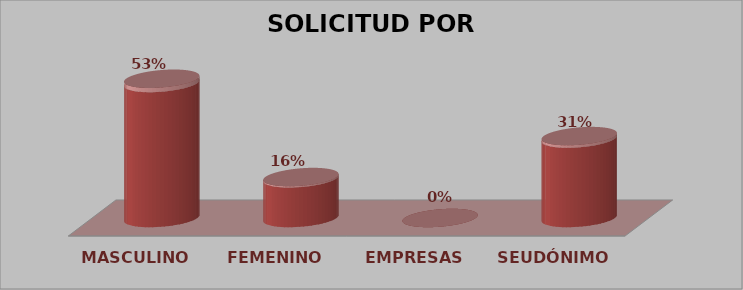
| Category | SOLICITUD POR GÉNERO | Series 1 |
|---|---|---|
| MASCULINO | 17 | 0.531 |
| FEMENINO | 5 | 0.156 |
| EMPRESAS | 0 | 0 |
| SEUDÓNIMO | 10 | 0.312 |